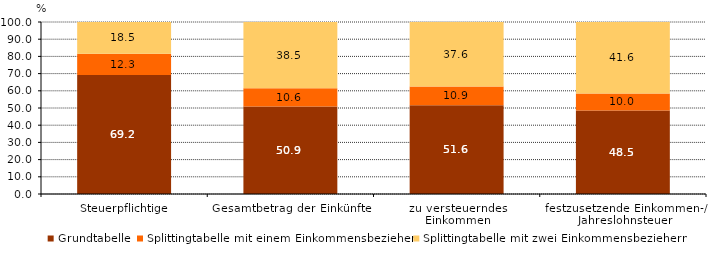
| Category | Grundtabelle | Splittingtabelle mit einem Einkommensbezieher | Splittingtabelle mit zwei Einkommensbeziehern |
|---|---|---|---|
| Steuerpflichtige | 69.2 | 12.3 | 18.5 |
| Gesamtbetrag der Einkünfte | 50.9 | 10.6 | 38.5 |
| zu versteuerndes 
Einkommen | 51.6 | 10.9 | 37.6 |
| festzusetzende Einkommen-/ Jahreslohnsteuer | 48.5 | 10 | 41.6 |